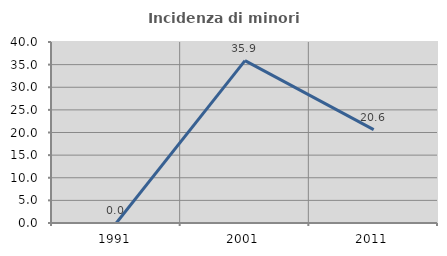
| Category | Incidenza di minori stranieri |
|---|---|
| 1991.0 | 0 |
| 2001.0 | 35.897 |
| 2011.0 | 20.635 |